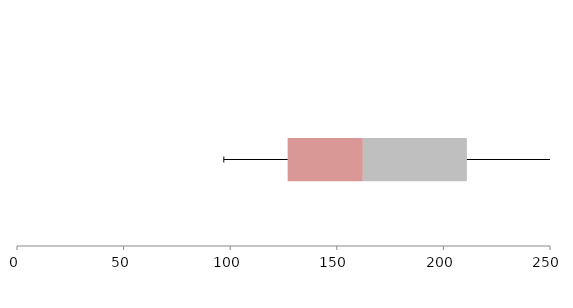
| Category | Series 1 | Series 2 | Series 3 |
|---|---|---|---|
| 0 | 126.952 | 35.259 | 48.798 |